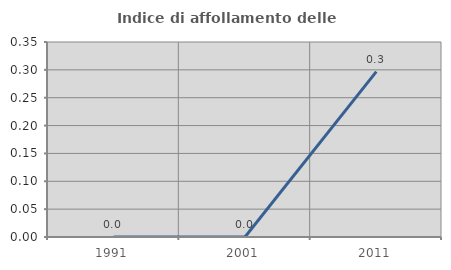
| Category | Indice di affollamento delle abitazioni  |
|---|---|
| 1991.0 | 0 |
| 2001.0 | 0 |
| 2011.0 | 0.297 |